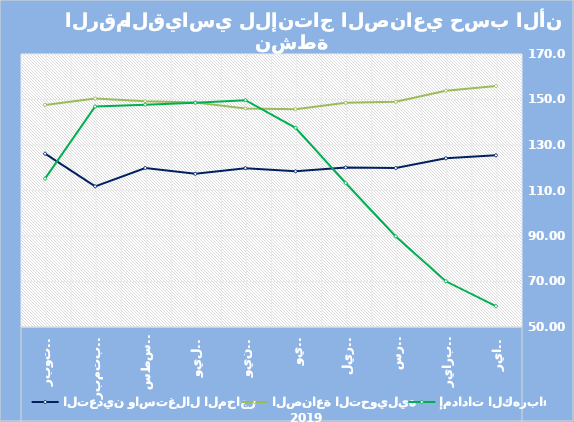
| Category | التعدين واستغلال المحاجر | الصناعة التحويلية | إمدادات الكهرباء |
|---|---|---|---|
| 0 | 125.45 | 155.98 | 59.15 |
| 1 | 124.14 | 153.87 | 70.1 |
| 2 | 119.87 | 148.98 | 89.82 |
| 3 | 120.11 | 148.54 | 113.29 |
| 4 | 118.43 | 145.76 | 137.57 |
| 5 | 119.81 | 146.05 | 149.7 |
| 6 | 117.33 | 148.68 | 148.56 |
| 7 | 119.89 | 149.23 | 147.74 |
| 8 | 111.81 | 150.42 | 146.92 |
| 9 | 126.188 | 147.61 | 115.237 |